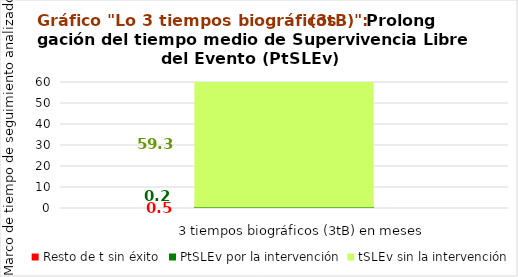
| Category | Resto de t sin éxito | PtSLEv por la intervención | tSLEv sin la intervención |
|---|---|---|---|
| 0 | 0.52 | 0.215 | 59.265 |